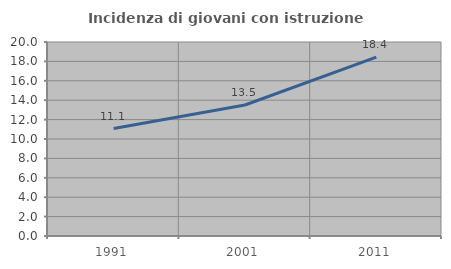
| Category | Incidenza di giovani con istruzione universitaria |
|---|---|
| 1991.0 | 11.074 |
| 2001.0 | 13.504 |
| 2011.0 | 18.44 |